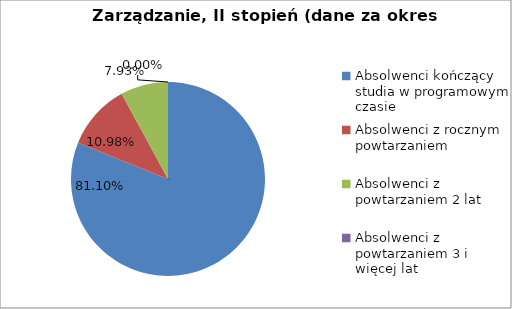
| Category | Series 0 |
|---|---|
| Absolwenci kończący studia w programowym czasie | 81.098 |
| Absolwenci z rocznym powtarzaniem | 10.976 |
| Absolwenci z powtarzaniem 2 lat | 7.927 |
| Absolwenci z powtarzaniem 3 i więcej lat | 0 |